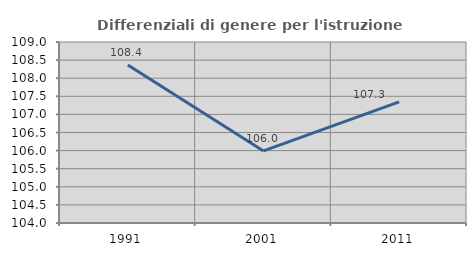
| Category | Differenziali di genere per l'istruzione superiore |
|---|---|
| 1991.0 | 108.362 |
| 2001.0 | 105.991 |
| 2011.0 | 107.346 |